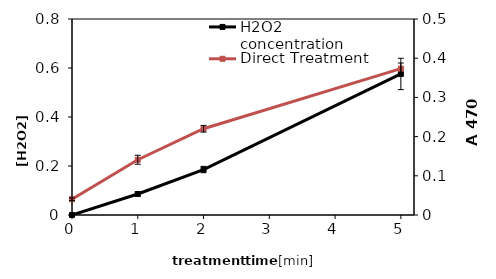
| Category | H2O2 concentration |
|---|---|
| 0.0 | 0 |
| 1.0 | 0.086 |
| 2.0 | 0.186 |
| 5.0 | 0.576 |